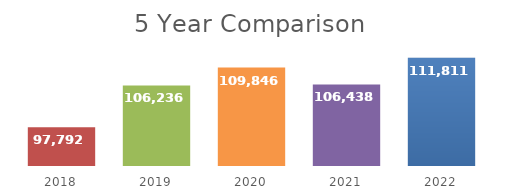
| Category | Series 0 |
|---|---|
| 2018.0 | 97792 |
| 2019.0 | 106236 |
| 2020.0 | 109846 |
| 2021.0 | 106438 |
| 2022.0 | 111811 |